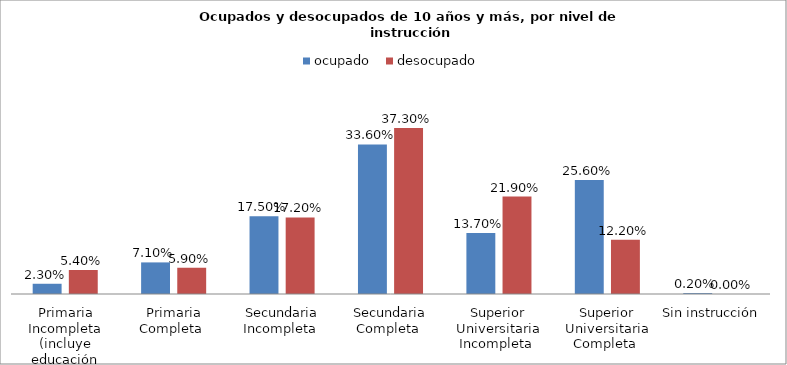
| Category | ocupado  | desocupado |
|---|---|---|
| Primaria Incompleta (incluye educación especial) | 0.023 | 0.054 |
| Primaria Completa  | 0.071 | 0.059 |
| Secundaria Incompleta  | 0.175 | 0.172 |
| Secundaria Completa  | 0.336 | 0.373 |
| Superior Universitaria Incompleta  | 0.137 | 0.219 |
| Superior Universitaria Completa  | 0.256 | 0.122 |
| Sin instrucción  | 0.002 | 0 |